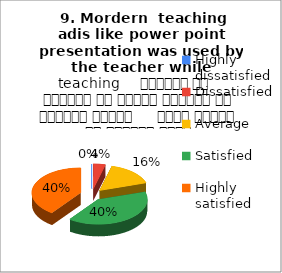
| Category |  9. Mordern  teaching adis like power point presentation was used by the teacher while teaching     शिक्षक ने शिक्षण के दौरान शिक्षण की आधुनिक तकनीक     पावर पॉइंट का प्रयोग किया |
|---|---|
| Highly dissatisfied | 0 |
| Dissatisfied | 1 |
| Average | 4 |
| Satisfied | 10 |
| Highly satisfied | 10 |